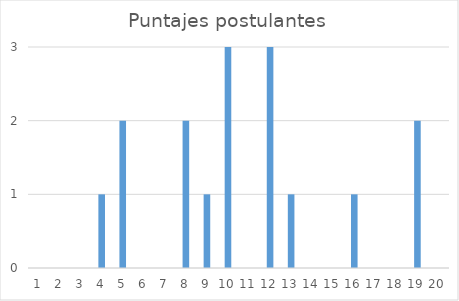
| Category | Series 0 |
|---|---|
| 0 | 0 |
| 1 | 0 |
| 2 | 0 |
| 3 | 1 |
| 4 | 2 |
| 5 | 0 |
| 6 | 0 |
| 7 | 2 |
| 8 | 1 |
| 9 | 3 |
| 10 | 0 |
| 11 | 3 |
| 12 | 1 |
| 13 | 0 |
| 14 | 0 |
| 15 | 1 |
| 16 | 0 |
| 17 | 0 |
| 18 | 2 |
| 19 | 0 |